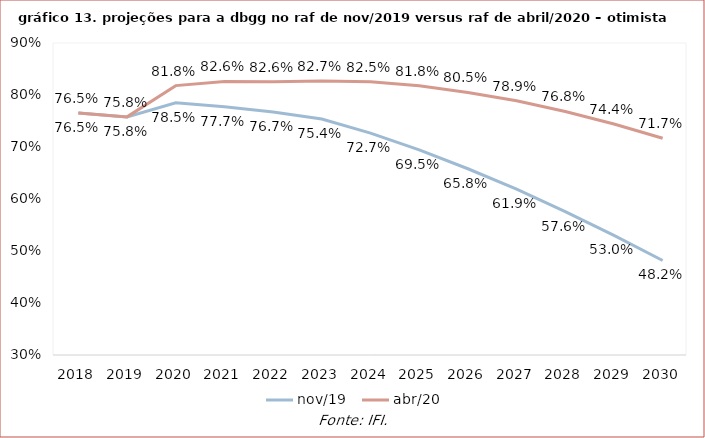
| Category | nov/19 | abr/20 |
|---|---|---|
| 2018.0 | 0.765 | 0.765 |
| 2019.0 | 0.758 | 0.758 |
| 2020.0 | 0.785 | 0.818 |
| 2021.0 | 0.777 | 0.826 |
| 2022.0 | 0.767 | 0.826 |
| 2023.0 | 0.754 | 0.827 |
| 2024.0 | 0.727 | 0.825 |
| 2025.0 | 0.695 | 0.818 |
| 2026.0 | 0.658 | 0.805 |
| 2027.0 | 0.619 | 0.789 |
| 2028.0 | 0.576 | 0.768 |
| 2029.0 | 0.53 | 0.744 |
| 2030.0 | 0.482 | 0.717 |